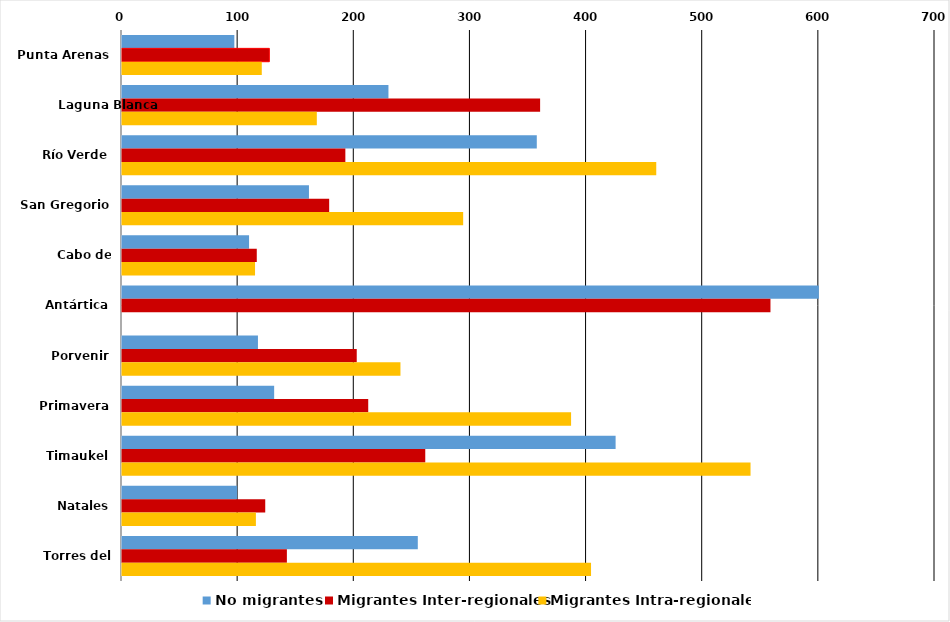
| Category | No migrantes | Migrantes Inter-regionales | Migrantes Intra-regionales |
|---|---|---|---|
| Punta Arenas | 96.72 | 126.857 | 120.349 |
| Laguna Blanca | 229.412 | 360 | 167.742 |
| Río Verde | 357.143 | 192.308 | 460 |
| San Gregorio | 160.976 | 178.378 | 293.75 |
| Cabo de Hornos | 109.404 | 116.04 | 114.545 |
| Antártica | 600 | 558.333 | 0 |
| Porvenir | 117.059 | 202.114 | 239.752 |
| Primavera | 131.008 | 212 | 386.667 |
| Timaukel | 425 | 261.111 | 541.176 |
| Natales | 99.156 | 123.33 | 115.288 |
| Torres del Paine | 254.688 | 141.964 | 403.846 |